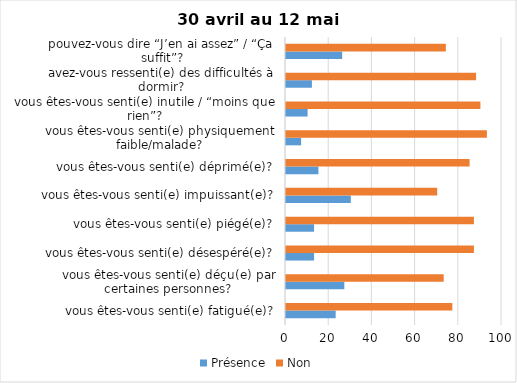
| Category | Présence | Non |
|---|---|---|
| vous êtes-vous senti(e) fatigué(e)? | 23 | 77 |
| vous êtes-vous senti(e) déçu(e) par certaines personnes? | 27 | 73 |
| vous êtes-vous senti(e) désespéré(e)? | 13 | 87 |
| vous êtes-vous senti(e) piégé(e)? | 13 | 87 |
| vous êtes-vous senti(e) impuissant(e)? | 30 | 70 |
| vous êtes-vous senti(e) déprimé(e)? | 15 | 85 |
| vous êtes-vous senti(e) physiquement faible/malade? | 7 | 93 |
| vous êtes-vous senti(e) inutile / “moins que rien”? | 10 | 90 |
| avez-vous ressenti(e) des difficultés à dormir? | 12 | 88 |
| pouvez-vous dire “J’en ai assez” / “Ça suffit”? | 26 | 74 |